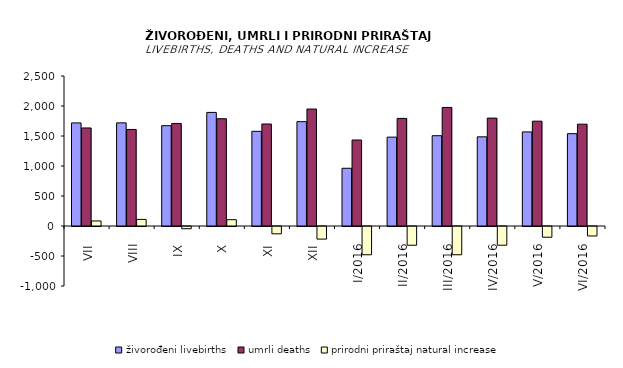
| Category | živorođeni livebirths | umrli deaths | prirodni priraštaj natural increase |
|---|---|---|---|
| VII | 1718 | 1634 | 84 |
| VIII | 1719 | 1609 | 110 |
| IX | 1672 | 1709 | -37 |
| X | 1893 | 1788 | 105 |
| XI | 1578 | 1700 | -122 |
| XII | 1739 | 1949 | -210 |
| I/2016 | 962 | 1433 | -471 |
| II/2016 | 1481 | 1793 | -312 |
| III/2016 | 1505 | 1976 | -471 |
| IV/2016 | 1486 | 1798 | -312 |
| V/2016 | 1568 | 1747 | -179 |
| VI/2016 | 1539 | 1697 | -158 |